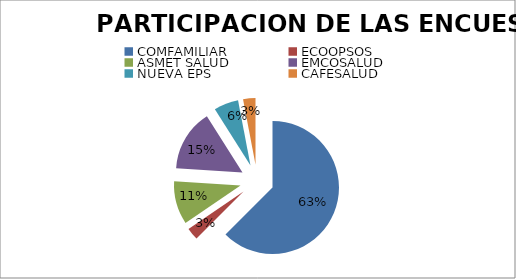
| Category | Series 0 | Series 1 |
|---|---|---|
| COMFAMILIAR | 125 | 0.625 |
| ECOOPSOS | 6 | 0.03 |
| ASMET SALUD | 21 | 0.105 |
| EMCOSALUD | 30 | 0.15 |
| NUEVA EPS | 12 | 0.06 |
| CAFESALUD | 6 | 0.03 |